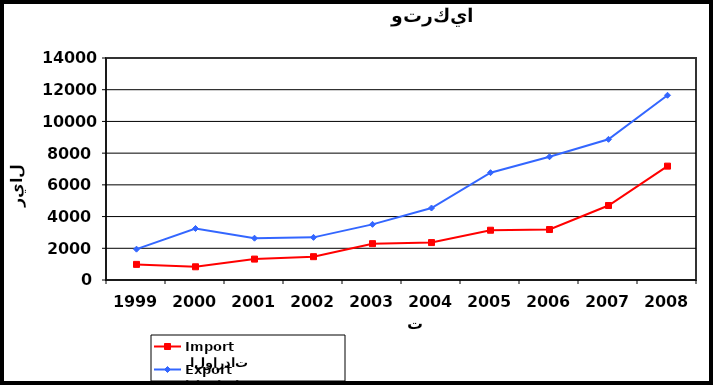
| Category |  الواردات           Import | الصادرات          Export |
|---|---|---|
| 1999.0 | 985 | 1944 |
| 2000.0 | 833 | 3248 |
| 2001.0 | 1319 | 2635 |
| 2002.0 | 1471 | 2689 |
| 2003.0 | 2292 | 3509 |
| 2004.0 | 2360 | 4539 |
| 2005.0 | 3139 | 6769 |
| 2006.0 | 3183 | 7771 |
| 2007.0 | 4699 | 8872 |
| 2008.0 | 7181 | 11650 |